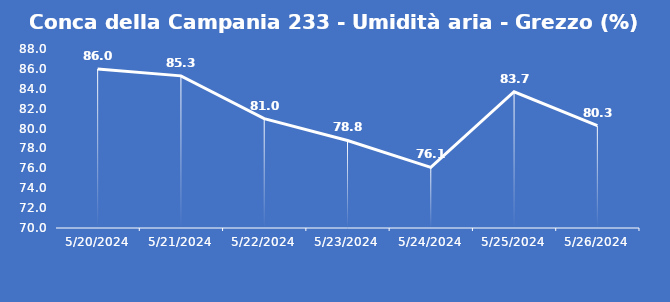
| Category | Conca della Campania 233 - Umidità aria - Grezzo (%) |
|---|---|
| 5/20/24 | 86 |
| 5/21/24 | 85.3 |
| 5/22/24 | 81 |
| 5/23/24 | 78.8 |
| 5/24/24 | 76.1 |
| 5/25/24 | 83.7 |
| 5/26/24 | 80.3 |